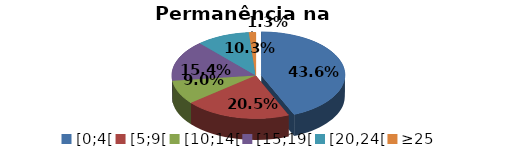
| Category | Series 0 |
|---|---|
| [0;4[ | 0.436 |
| [5;9[ | 0.205 |
| [10;14[ | 0.09 |
| [15;19[ | 0.154 |
| [20,24[ | 0.103 |
| ≥25 | 0.013 |